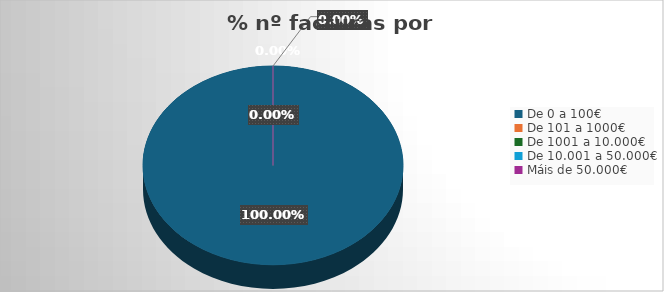
| Category | Series 0 | Rexional | Nacional | Estranxeiro | Total |
|---|---|---|---|---|---|
| De 0 a 100€ | 354657762938.23 | 0.015 | 0.167 | 0.008 | 354657762938.23 |
| De 101 a 1000€ | 0.019 | 0.001 | 0.01 | 0.001 | 0.019 |
| De 1001 a 10.000€ | 0.17 | 0.022 | 0.055 | 0.01 | 0.17 |
| De 10.001 a 50.000€ | 0.454 | 0.039 | 0.127 | 0.027 | 0.454 |
| Máis de 50.000€ | 0.003 | 0 | 0.002 | 0 | 0.003 |